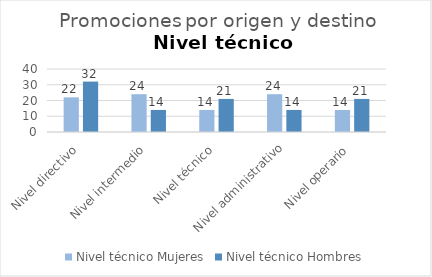
| Category | Nivel técnico |
|---|---|
| Nivel directivo | 32 |
| Nivel intermedio | 14 |
| Nivel técnico | 21 |
| Nivel administrativo | 14 |
| Nivel operario | 21 |